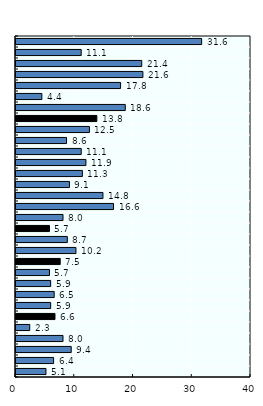
| Category |  Males |
|---|---|
| Japan | 31.6 |
| Hong Kong, China | 11.1 |
| Singapore | 21.4 |
| Australia | 21.6 |
| Korea, Rep. | 17.8 |
| New Zealand | 4.4 |
| Asia Pacific-H | 18.6 |
| Macau, China | 13.76 |
| OECD | 12.5 |
| Brunei Darussalam | 8.6 |
| China | 11.1 |
| Viet Nam | 11.9 |
| Thailand | 11.3 |
| Malaysia | 9.1 |
| Sri Lanka | 14.8 |
| Asia Pacific-UM | 16.6 |
| Bangladesh | 8 |
| Nepal | 5.7 |
| Solomon Islands | 8.735 |
| Korea, DPR | 10.2 |
| Fiji | 7.525 |
| Mongolia | 5.7 |
| Cambodia | 5.9 |
| Indonesia | 6.5 |
| Asia Pacific-LM/L | 5.9 |
| Philippines | 6.635 |
| India | 2.34 |
| Myanmar | 8 |
| Pakistan | 9.4 |
| Papua New Guinea | 6.4 |
| Lao PDR | 5.1 |